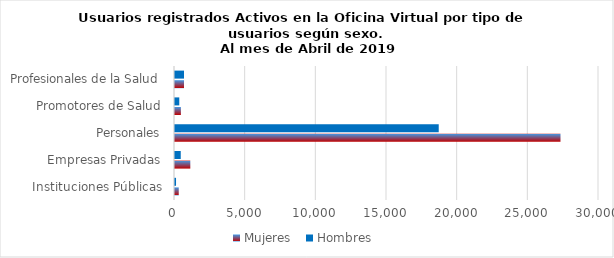
| Category | Mujeres | Hombres |
|---|---|---|
| Instituciones Públicas | 265 | 73 |
| Empresas Privadas | 1083 | 406 |
| Personales | 27275 | 18660 |
| Promotores de Salud | 416 | 302 |
| Profesionales de la Salud | 639 | 638 |